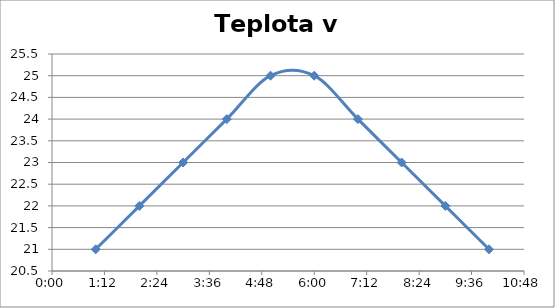
| Category | teplota |
|---|---|
| 0.041666666666666664 | 21 |
| 0.0833333333333333 | 22 |
| 0.125 | 23 |
| 0.166666666666667 | 24 |
| 0.208333333333333 | 25 |
| 0.25 | 25 |
| 0.291666666666667 | 24 |
| 0.333333333333333 | 23 |
| 0.375 | 22 |
| 0.416666666666667 | 21 |